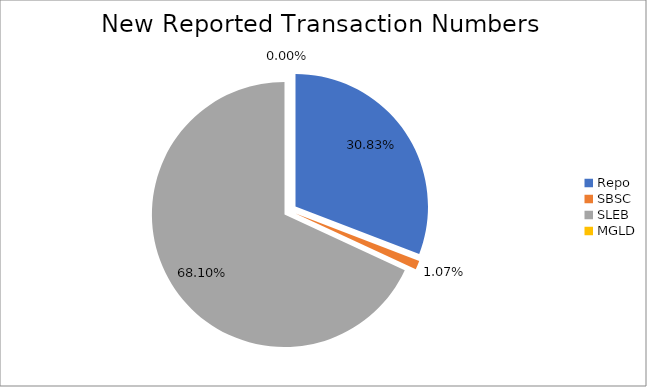
| Category | Series 0 |
|---|---|
| Repo | 288730 |
| SBSC | 10020 |
| SLEB | 637807 |
| MGLD | 16 |